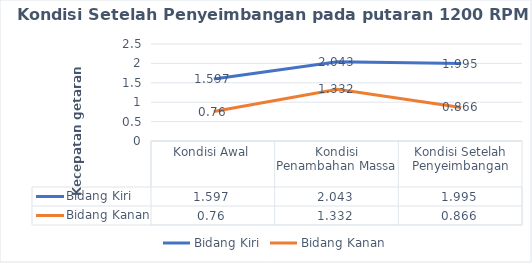
| Category | Bidang Kiri | Bidang Kanan |
|---|---|---|
| Kondisi Awal | 1.597 | 0.76 |
| Kondisi Penambahan Massa | 2.043 | 1.332 |
| Kondisi Setelah Penyeimbangan | 1.995 | 0.866 |